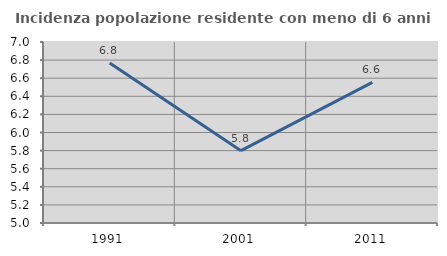
| Category | Incidenza popolazione residente con meno di 6 anni |
|---|---|
| 1991.0 | 6.768 |
| 2001.0 | 5.799 |
| 2011.0 | 6.553 |